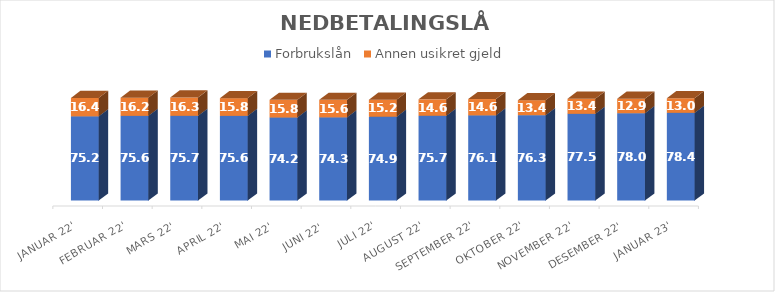
| Category | Forbrukslån | Annen usikret gjeld |
|---|---|---|
| Januar 22' | 75.228 | 16.412 |
| Februar 22' | 75.643 | 16.245 |
| Mars 22' | 75.683 | 16.322 |
| April 22' | 75.632 | 15.813 |
| Mai 22' | 74.197 | 15.754 |
| Juni 22' | 74.321 | 15.592 |
| Juli 22' | 74.887 | 15.201 |
| August 22' | 75.735 | 14.635 |
| September 22' | 76.076 | 14.561 |
| Oktober 22' | 76.263 | 13.384 |
| November 22' | 77.464 | 13.432 |
| Desember 22' | 78.028 | 12.874 |
| Januar 23' | 78.359 | 12.994 |